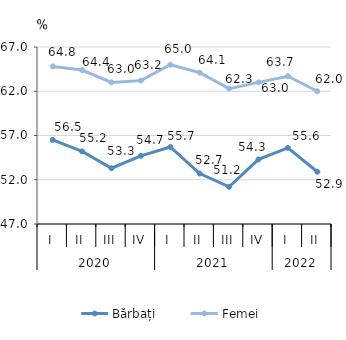
| Category | Bărbați | Femei |
|---|---|---|
| 0 | 56.5 | 64.8 |
| 1 | 55.2 | 64.4 |
| 2 | 53.3 | 63 |
| 3 | 54.7 | 63.2 |
| 4 | 55.7 | 65 |
| 5 | 52.7 | 64.1 |
| 6 | 51.2 | 62.3 |
| 7 | 54.3 | 63 |
| 8 | 55.6 | 63.7 |
| 9 | 52.9 | 62 |